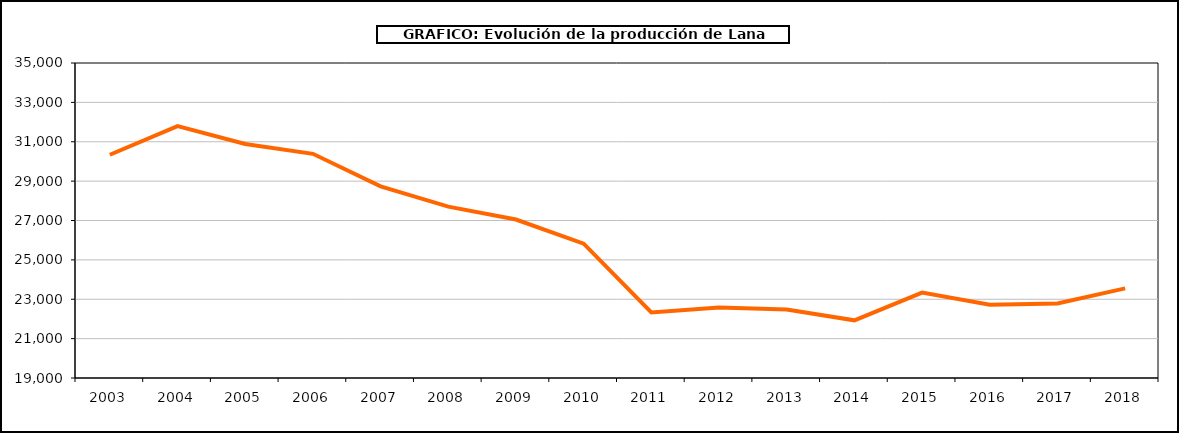
| Category | Lana |
|---|---|
| 2003.0 | 30340.64 |
| 2004.0 | 31796.74 |
| 2005.0 | 30888.43 |
| 2006.0 | 30387.145 |
| 2007.0 | 28736.496 |
| 2008.0 | 27705.371 |
| 2009.0 | 27048.693 |
| 2010.0 | 25825 |
| 2011.0 | 22333.5 |
| 2012.0 | 22583.2 |
| 2013.0 | 22476.583 |
| 2014.0 | 21929.646 |
| 2015.0 | 23336.469 |
| 2016.0 | 22723.741 |
| 2017.0 | 22788.995 |
| 2018.0 | 23553.736 |